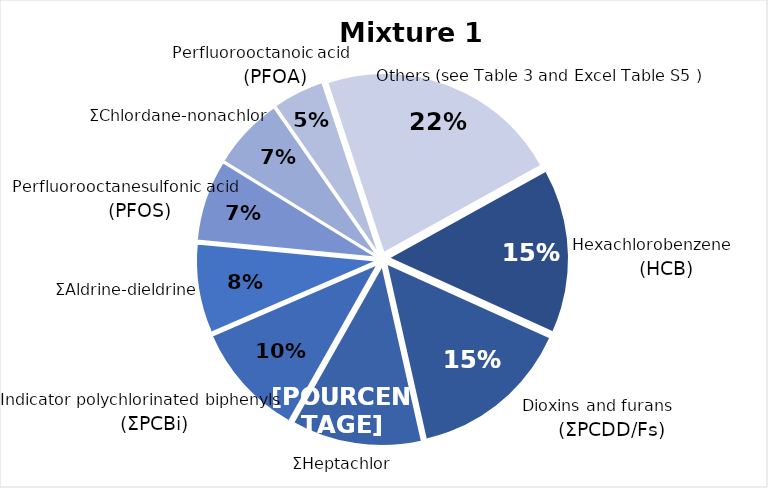
| Category | Series 0 |
|---|---|
| Hexachlorobenzene (HCB) | 0.148 |
| Dioxins and furans (ΣPCDD/Fs) | 0.147 |
| ΣHeptachlor | 0.117 |
| Indicator polychlorinated biphenyls (ΣPCBi) | 0.103 |
| ΣAldrine-dieldrine | 0.08 |
| Perfluorooctanesulfonic acid (PFOS) | 0.073 |
| ΣChlordane-nonachlor | 0.065 |
| Perfluorooctanoic acid (PFOA) | 0.046 |
| Others (see Table 1 and SE3 ) | 0.22 |